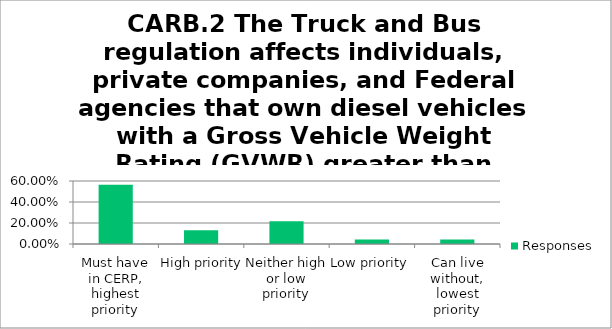
| Category | Responses |
|---|---|
| Must have in CERP, highest priority | 0.565 |
| High priority | 0.13 |
| Neither high or low priority | 0.217 |
| Low priority | 0.044 |
| Can live without, lowest priority | 0.044 |